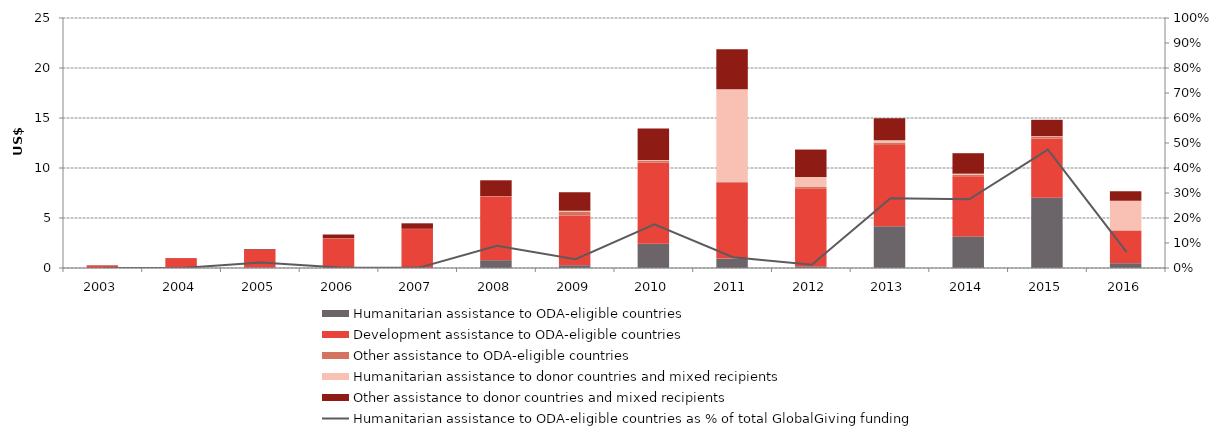
| Category | Humanitarian assistance to ODA-eligible countries | Development assistance to ODA-eligible countries | Other assistance to ODA-eligible countries | Humanitarian assistance to donor countries and mixed recipients | Other assistance to donor countries and mixed recipients |
|---|---|---|---|---|---|
| 2003.0 | 0 | 0.258 | 0 | 0 | 0.014 |
| 2004.0 | 0 | 0.988 | 0 | 0 | 0.013 |
| 2005.0 | 0.041 | 1.76 | 0 | 0.012 | 0.072 |
| 2006.0 | 0.006 | 2.945 | 0.021 | 0 | 0.377 |
| 2007.0 | 0.002 | 3.891 | 0 | 0.026 | 0.55 |
| 2008.0 | 0.781 | 6.36 | 0.055 | 0 | 1.575 |
| 2009.0 | 0.268 | 4.977 | 0.346 | 0.131 | 1.845 |
| 2010.0 | 2.432 | 8.121 | 0.201 | 0.049 | 3.156 |
| 2011.0 | 0.939 | 7.569 | 0.087 | 9.29 | 3.986 |
| 2012.0 | 0.159 | 7.753 | 0.189 | 1.001 | 2.743 |
| 2013.0 | 4.182 | 8.115 | 0.243 | 0.244 | 2.2 |
| 2014.0 | 3.158 | 6.006 | 0.169 | 0.101 | 2.046 |
| 2015.0 | 7.021 | 5.909 | 0.17 | 0.082 | 1.638 |
| 2016.0 | 0.485 | 3.252 | 0.05 | 2.945 | 0.933 |